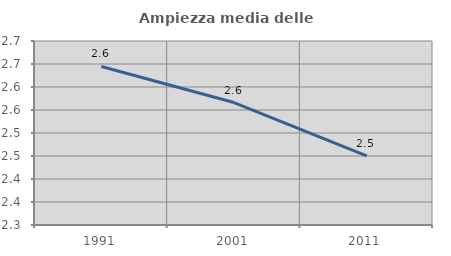
| Category | Ampiezza media delle famiglie |
|---|---|
| 1991.0 | 2.645 |
| 2001.0 | 2.566 |
| 2011.0 | 2.45 |